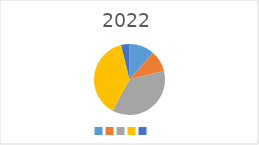
| Category | Series 0 |
|---|---|
|  | 60000 |
|  | 50000 |
|  | 193800 |
|  | 200000 |
|  | 20000 |